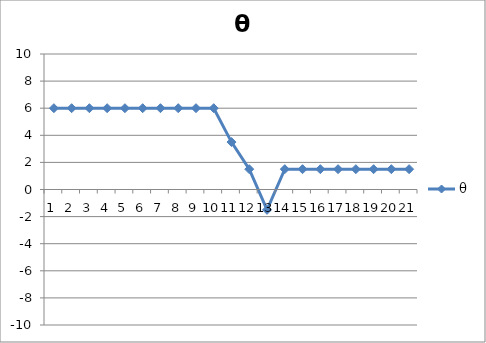
| Category | θ |
|---|---|
| 0 | 6 |
| 1 | 6 |
| 2 | 6 |
| 3 | 6 |
| 4 | 6 |
| 5 | 6 |
| 6 | 6 |
| 7 | 6 |
| 8 | 6 |
| 9 | 6 |
| 10 | 3.5 |
| 11 | 1.5 |
| 12 | -1.5 |
| 13 | 1.5 |
| 14 | 1.5 |
| 15 | 1.5 |
| 16 | 1.5 |
| 17 | 1.5 |
| 18 | 1.5 |
| 19 | 1.5 |
| 20 | 1.5 |